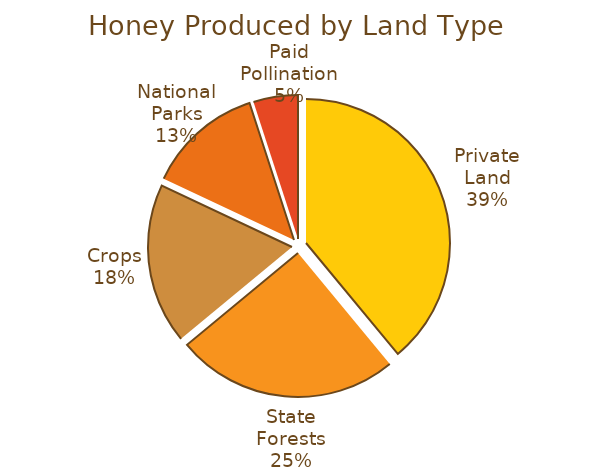
| Category | Series 0 |
|---|---|
| Private Land | 0.39 |
| State Forests | 0.25 |
| Crops | 0.18 |
| National Parks | 0.13 |
| Paid Pollination | 0.05 |